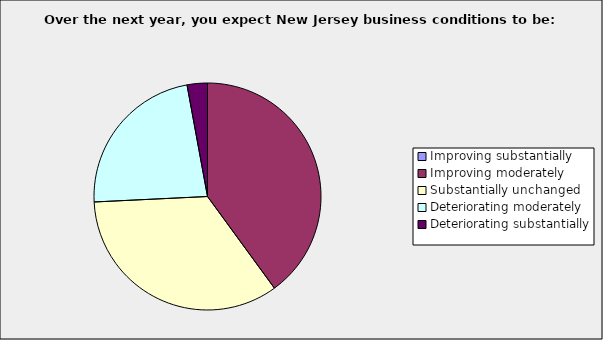
| Category | Series 0 |
|---|---|
| Improving substantially | 0 |
| Improving moderately | 0.4 |
| Substantially unchanged | 0.343 |
| Deteriorating moderately | 0.229 |
| Deteriorating substantially | 0.029 |